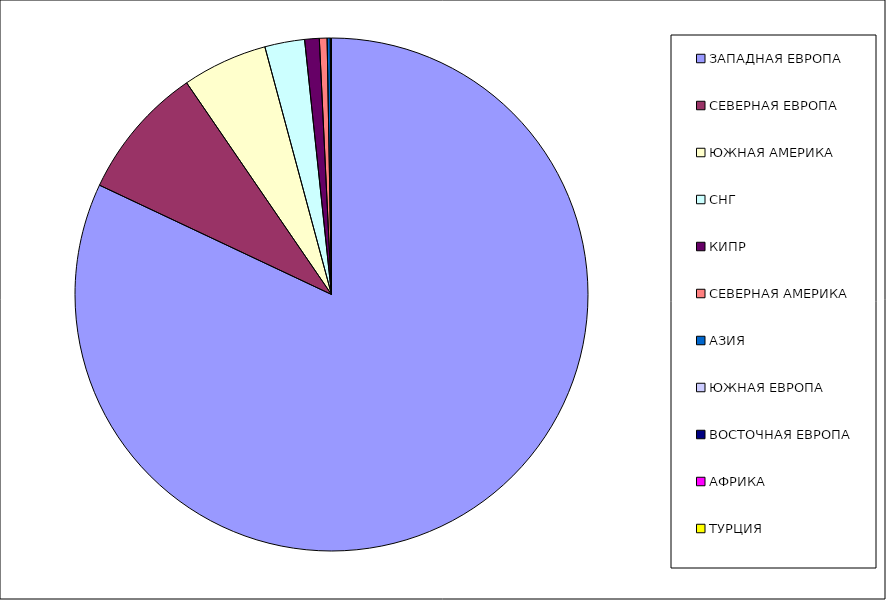
| Category | Оборот |
|---|---|
| ЗАПАДНАЯ ЕВРОПА | 0.82 |
| СЕВЕРНАЯ ЕВРОПА | 0.084 |
| ЮЖНАЯ АМЕРИКА | 0.054 |
| СНГ | 0.025 |
| КИПР | 0.009 |
| СЕВЕРНАЯ АМЕРИКА | 0.005 |
| АЗИЯ | 0.002 |
| ЮЖНАЯ ЕВРОПА | 0.001 |
| ВОСТОЧНАЯ ЕВРОПА | 0 |
| АФРИКА | 0 |
| ТУРЦИЯ | 0 |